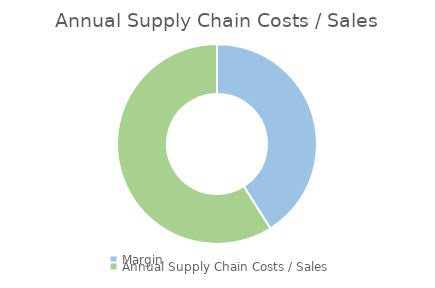
| Category | Series 0 |
|---|---|
| Margin | 0.41 |
| Annual Supply Chain Costs / Sales | 0.59 |